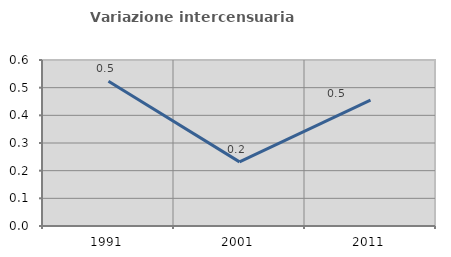
| Category | Variazione intercensuaria annua |
|---|---|
| 1991.0 | 0.523 |
| 2001.0 | 0.232 |
| 2011.0 | 0.455 |